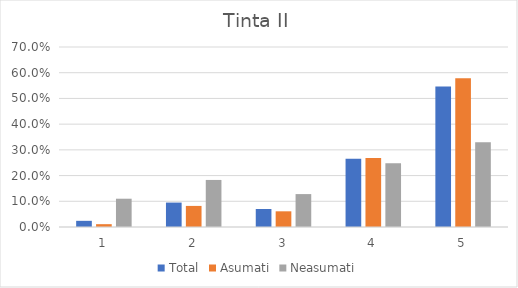
| Category | Total | Asumati | Neasumati |
|---|---|---|---|
| 0 | 0.024 | 0.011 | 0.11 |
| 1 | 0.095 | 0.082 | 0.183 |
| 2 | 0.07 | 0.061 | 0.128 |
| 3 | 0.265 | 0.268 | 0.248 |
| 4 | 0.546 | 0.578 | 0.33 |